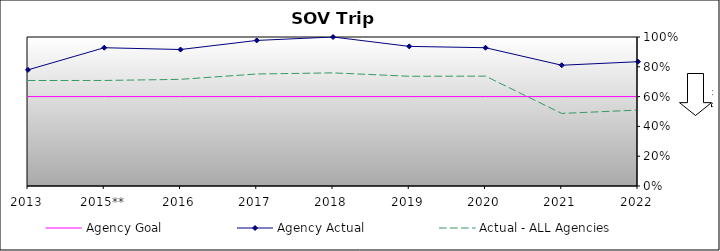
| Category | Agency Goal | Agency Actual | Actual - ALL Agencies |
|---|---|---|---|
| 2013 | 0.6 | 0.78 | 0.708 |
| 2015** | 0.6 | 0.928 | 0.708 |
| 2016 | 0.6 | 0.916 | 0.716 |
| 2017 | 0.6 | 0.977 | 0.752 |
| 2018 | 0.6 | 1 | 0.759 |
| 2019 | 0.6 | 0.937 | 0.736 |
| 2020 | 0.6 | 0.928 | 0.737 |
| 2021 | 0.6 | 0.81 | 0.487 |
| 2022 | 0.6 | 0.834 | 0.509 |